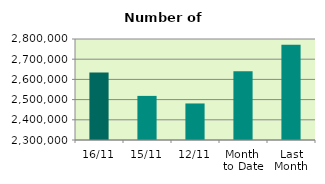
| Category | Series 0 |
|---|---|
| 16/11 | 2633816 |
| 15/11 | 2518342 |
| 12/11 | 2480890 |
| Month 
to Date | 2640662 |
| Last
Month | 2771381.143 |